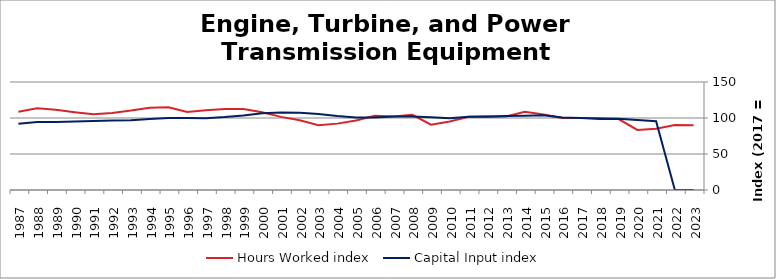
| Category | Hours Worked index | Capital Input index |
|---|---|---|
| 2023.0 | 89.838 | 0 |
| 2022.0 | 90.241 | 0 |
| 2021.0 | 85.196 | 95.587 |
| 2020.0 | 83.447 | 97.127 |
| 2019.0 | 98.478 | 98.887 |
| 2018.0 | 100.051 | 98.655 |
| 2017.0 | 100 | 100 |
| 2016.0 | 99.975 | 100.76 |
| 2015.0 | 104.842 | 103.798 |
| 2014.0 | 108.644 | 103.126 |
| 2013.0 | 102.079 | 102.9 |
| 2012.0 | 102.332 | 101.887 |
| 2011.0 | 101.597 | 101.632 |
| 2010.0 | 95.162 | 99.506 |
| 2009.0 | 90.764 | 100.955 |
| 2008.0 | 104.421 | 102.226 |
| 2007.0 | 102.102 | 101.936 |
| 2006.0 | 103.063 | 100.723 |
| 2005.0 | 96.61 | 100.832 |
| 2004.0 | 92.184 | 102.702 |
| 2003.0 | 90.045 | 105.578 |
| 2002.0 | 96.817 | 107.407 |
| 2001.0 | 101.537 | 107.727 |
| 2000.0 | 108.07 | 106.43 |
| 1999.0 | 112.572 | 103.512 |
| 1998.0 | 112.332 | 101.245 |
| 1997.0 | 110.626 | 99.627 |
| 1996.0 | 108.467 | 99.88 |
| 1995.0 | 114.774 | 99.829 |
| 1994.0 | 114.291 | 98.543 |
| 1993.0 | 110.358 | 97.015 |
| 1992.0 | 107.076 | 96.575 |
| 1991.0 | 105.366 | 95.85 |
| 1990.0 | 108.081 | 95.208 |
| 1989.0 | 111.319 | 94.616 |
| 1988.0 | 113.686 | 94.278 |
| 1987.0 | 108.608 | 92.029 |